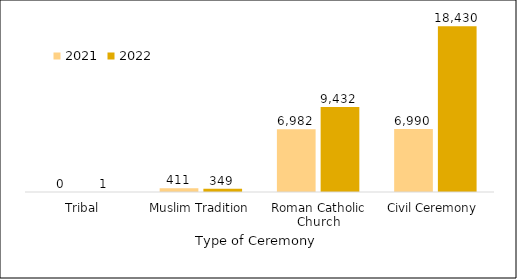
| Category | 2021 | 2022 |
|---|---|---|
| Tribal | 0 | 1 |
| Muslim Tradition | 411 | 349 |
| Roman Catholic Church | 6982 | 9432 |
| Civil Ceremony | 6990 | 18430 |